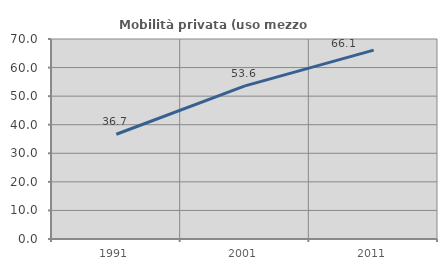
| Category | Mobilità privata (uso mezzo privato) |
|---|---|
| 1991.0 | 36.661 |
| 2001.0 | 53.604 |
| 2011.0 | 66.112 |